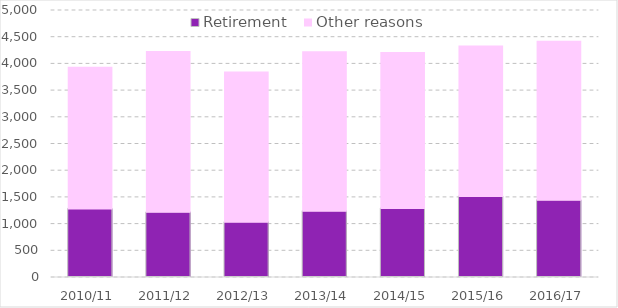
| Category | Retirement | Other reasons |
|---|---|---|
| 2010/11 | 1284 | 2652 |
| 2011/12 | 1220 | 3010 |
| 2012/13 | 1036 | 2811 |
| 2013/14 | 1242 | 2986 |
| 2014/15 | 1292 | 2921 |
| 2015/16 | 1518 | 2815 |
| 2016/17 | 1446 | 2978.999 |